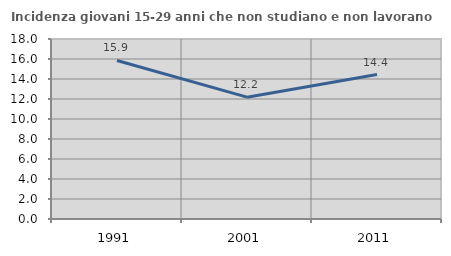
| Category | Incidenza giovani 15-29 anni che non studiano e non lavorano  |
|---|---|
| 1991.0 | 15.854 |
| 2001.0 | 12.185 |
| 2011.0 | 14.444 |